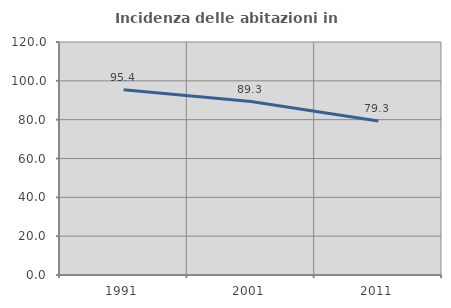
| Category | Incidenza delle abitazioni in proprietà  |
|---|---|
| 1991.0 | 95.411 |
| 2001.0 | 89.347 |
| 2011.0 | 79.283 |